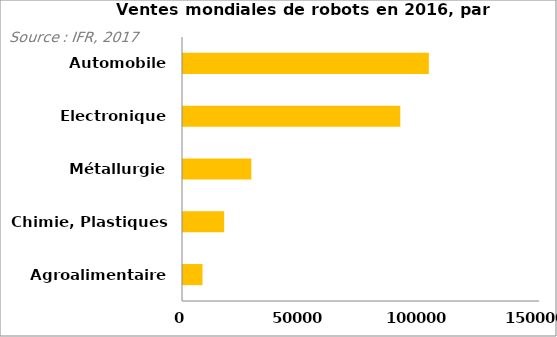
| Category | Series 0 |
|---|---|
| Agroalimentaire | 8200 |
| Chimie, Plastiques | 17300 |
| Métallurgie | 28700 |
| Electronique | 91300 |
| Automobile | 103300 |